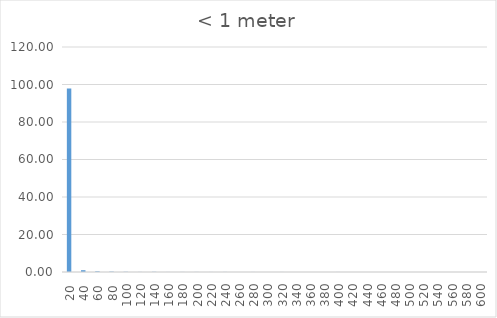
| Category | Series 0 |
|---|---|
| 20.0 | 97.904 |
| 40.0 | 0.961 |
| 60.0 | 0.366 |
| 80.0 | 0.202 |
| 100.0 | 0.114 |
| 120.0 | 0.05 |
| 140.0 | 0.101 |
| 160.0 | 0.025 |
| 180.0 | 0.038 |
| 200.0 | 0.038 |
| 220.0 | 0.025 |
| 240.0 | 0.038 |
| 260.0 | 0 |
| 280.0 | 0.025 |
| 300.0 | 0 |
| 320.0 | 0.025 |
| 340.0 | 0 |
| 360.0 | 0.013 |
| 380.0 | 0 |
| 400.0 | 0.025 |
| 420.0 | 0 |
| 440.0 | 0.013 |
| 460.0 | 0.013 |
| 480.0 | 0 |
| 500.0 | 0 |
| 520.0 | 0.013 |
| 540.0 | 0 |
| 560.0 | 0 |
| 580.0 | 0 |
| 600.0 | 0.013 |